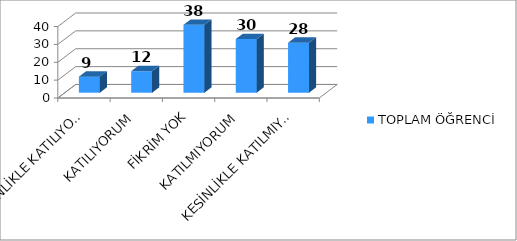
| Category | TOPLAM ÖĞRENCİ |
|---|---|
| KESİNLİKLE KATILIYORUM | 9 |
| KATILIYORUM | 12 |
| FİKRİM YOK | 38 |
| KATILMIYORUM | 30 |
| KESİNLİKLE KATILMIYORUM | 28 |